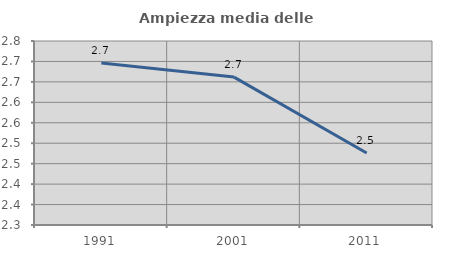
| Category | Ampiezza media delle famiglie |
|---|---|
| 1991.0 | 2.696 |
| 2001.0 | 2.662 |
| 2011.0 | 2.476 |